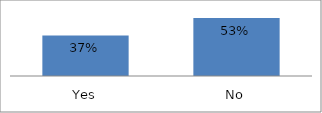
| Category | Series 0 |
|---|---|
| Yes | 0.368 |
| No | 0.526 |